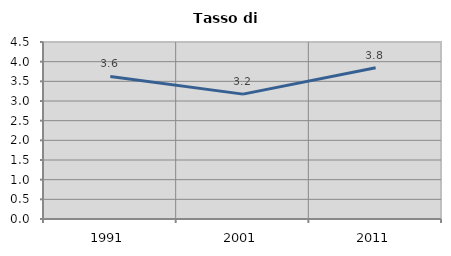
| Category | Tasso di disoccupazione   |
|---|---|
| 1991.0 | 3.623 |
| 2001.0 | 3.175 |
| 2011.0 | 3.846 |